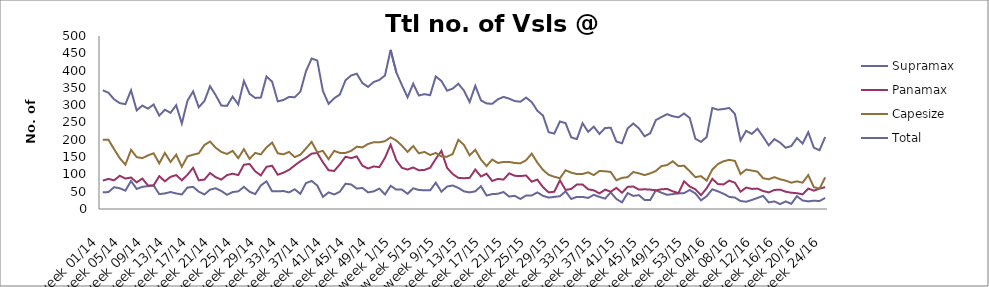
| Category | Supramax | Panamax | Capesize | Total |
|---|---|---|---|---|
| week 01/14 | 48 | 82 | 200 | 343 |
| week 02/14 | 49 | 87 | 200 | 336 |
| week 03/14 | 63 | 83 | 173 | 317 |
| week 04/14 | 60 | 96 | 147 | 306 |
| week 05/14 | 53 | 88 | 128 | 303 |
| week 06/14 | 81 | 91 | 171 | 343 |
| week 07/14 | 58 | 77 | 150 | 285 |
| week 08/14 | 64 | 88 | 147 | 299 |
| week 09/14 | 66 | 68 | 155 | 290 |
| week 10/14 | 68 | 68 | 161 | 302 |
| week 11/14 | 43 | 95 | 132 | 270 |
| week 12/14 | 45 | 80 | 162 | 287 |
| week 13/14 | 49 | 93 | 136 | 278 |
| week 14/14 | 45 | 98 | 157 | 300 |
| week 15/14 | 42 | 83 | 122 | 247 |
| week 16/14 | 62 | 99 | 152 | 313 |
| week 17/14 | 64 | 119 | 157 | 340 |
| week 18/14 | 50 | 83 | 161 | 294 |
| week 19/14 | 42 | 85 | 185 | 312 |
| week 20/14 | 56 | 104 | 195 | 355 |
| week 21/14 | 60 | 92 | 177 | 329 |
| week 22/14 | 52 | 85 | 165 | 299 |
| week 23/14 | 41 | 98 | 159 | 298 |
| week 24/14 | 49 | 102 | 168 | 325 |
| week 25/14 | 51 | 98 | 147 | 302 |
| week 26/14 | 64 | 128 | 173 | 370 |
| week 27/14 | 50 | 130 | 145 | 333 |
| week 28/14 | 43 | 109 | 162 | 321 |
| week 29/14 | 68 | 97 | 158 | 322 |
| week 30/14 | 80 | 122 | 178 | 383 |
| week 31/14 | 51 | 125 | 192 | 368 |
| week 32/14 | 51 | 99 | 161 | 311 |
| week 33/14 | 52 | 105 | 158 | 315 |
| week 34/14 | 48 | 113 | 165 | 324 |
| week 35/14 | 57 | 126 | 150 | 323 |
| week 36/14 | 44 | 138 | 157 | 339 |
| week 37/14 | 75 | 148 | 175 | 398 |
| week 38/14 | 81 | 160 | 194 | 435 |
| week 39/14 | 68 | 162 | 164 | 429 |
| week 40/14 | 35 | 135 | 168 | 341 |
| week 41/14 | 48 | 112 | 144 | 304 |
| week 42/14 | 42 | 110 | 168 | 320 |
| week 43/14 | 50 | 129 | 162 | 331 |
| week 44/14 | 73 | 151 | 162 | 372 |
| week 45/14 | 71 | 147 | 168 | 386 |
| week 46/14 | 59 | 152 | 180 | 391 |
| week 47/14 | 61 | 125 | 178 | 364 |
| week 48/14 | 48 | 117 | 188 | 353 |
| week 49/14 | 51 | 123 | 193 | 367 |
| week 50/14 | 59 | 121 | 193 | 373 |
| week 51/14 | 42 | 148 | 196 | 386 |
| week 52/14 | 67 | 186 | 207 | 460 |
| week 1/15 | 56 | 141 | 198 | 395 |
| week 2/15 | 56 | 119 | 183 | 358 |
| week 3/15 | 44 | 114 | 165 | 323 |
| week 4/15 | 60 | 120 | 182 | 362 |
| week 5/15 | 55 | 112 | 161 | 328 |
| week 6/15 | 54 | 113 | 165 | 332 |
| week 7/15 | 54 | 119 | 156 | 329 |
| week 8/15 | 76 | 145 | 162 | 383 |
| week 9/15 | 50 | 168 | 152 | 370 |
| week 10/15 | 65 | 119 | 151 | 342 |
| week 11/15 | 68 | 101 | 159 | 348 |
| week 12/15 | 61 | 90 | 200 | 362 |
| week 13/15 | 51 | 89 | 185 | 342 |
| week 14/15 | 48 | 90 | 155 | 309 |
| week 15/15 | 51 | 114 | 171 | 356 |
| week 16/15 | 66 | 94 | 143 | 314 |
| week 17/15 | 39 | 102 | 124 | 305 |
| week 18/15 | 43 | 81 | 143 | 304 |
| week 19/15 | 44 | 87 | 133 | 317 |
| week 20/15 | 49 | 85 | 136 | 324 |
| week 21/15 | 36 | 103 | 136 | 319 |
| week 22/15 | 38 | 96 | 133 | 312 |
| week 23/15 | 29 | 95 | 132 | 310 |
| week 24/15 | 39 | 97 | 141 | 322 |
| week 25/15 | 39 | 79 | 160 | 309 |
| week 26/15 | 48 | 85 | 134 | 284 |
| week 27/15 | 38 | 63 | 113 | 270 |
| week 28/15 | 33 | 48 | 99 | 222 |
| week 29/15 | 35 | 50 | 93 | 218 |
| week 30/15 | 37 | 83 | 89 | 253 |
| week 31/15 | 51 | 55 | 112 | 248 |
| week 32/15 | 29 | 58 | 105 | 207 |
| week 33/15 | 35 | 71 | 101 | 202 |
| week 34/15 | 35 | 71 | 101 | 248 |
| week 35/15 | 32 | 57 | 106 | 223 |
| week 36/15 | 41 | 54 | 98 | 238 |
| week 37/15 | 35 | 45 | 110 | 217 |
| week 38/15 | 30 | 56 | 109 | 234 |
| week 39/15 | 48 | 50 | 107 | 235 |
| week 40/15 | 29 | 61 | 83 | 195 |
| week 41/15 | 19 | 47 | 90 | 190 |
| week 42/15 | 46 | 64 | 92 | 233 |
| week 43/15 | 38 | 65 | 107 | 247 |
| week 44/15 | 40 | 56 | 103 | 233 |
| week 45/15 | 26 | 57 | 98 | 210 |
| week 46/15 | 26 | 56 | 103 | 219 |
| week 47/15 | 54 | 54 | 110 | 257 |
| week 48/15 | 47 | 57 | 124 | 266 |
| week 49/15 | 41 | 58 | 127 | 274 |
| week 50/15 | 43 | 51 | 138 | 268 |
| week 51/15 | 45 | 46 | 124 | 265 |
| week 52/15 | 46 | 80 | 125 | 276 |
| week 53/15 | 55 | 65 | 109 | 263 |
| week 01/16 | 45 | 57 | 92 | 203 |
| week 02/16 | 25 | 40 | 95 | 194 |
| week 03/16 | 37 | 60 | 82 | 208 |
| week 04/16 | 57 | 87 | 114 | 292 |
| week 05/16 | 51 | 72 | 130 | 287 |
| week 06/16 | 44 | 71 | 138 | 289 |
| week 07/16 | 35 | 82 | 142 | 292 |
| week 08/16 | 33 | 76 | 139 | 275 |
| week 09/16 | 23 | 50 | 101 | 198 |
| week 10/16 | 21 | 62 | 114 | 226 |
| week 11/16 | 26 | 58 | 111 | 217 |
| week 12/16 | 32 | 59 | 108 | 232 |
| week 13/16 | 38 | 52 | 89 | 209 |
| week 14/16 | 19 | 48 | 86 | 184 |
| week 15/16 | 22 | 55 | 92 | 202 |
| week 16/16 | 14 | 56 | 86 | 192 |
| week 17/16 | 22 | 50 | 82 | 177 |
| week 18/16 | 15 | 47 | 76 | 182 |
| week 19/16 | 37 | 45.667 | 80 | 205 |
| week 20/16 | 24.6 | 42.333 | 76 | 189 |
| week 21/16 | 22 | 59 | 98 | 222 |
| week 22/16 | 24 | 53 | 63 | 177 |
| week 23/16 | 23 | 59 | 59 | 170 |
| week 24/16 | 32 | 63 | 91 | 208 |